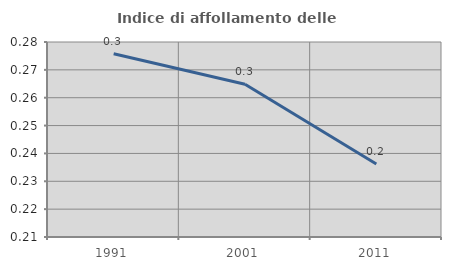
| Category | Indice di affollamento delle abitazioni  |
|---|---|
| 1991.0 | 0.276 |
| 2001.0 | 0.265 |
| 2011.0 | 0.236 |